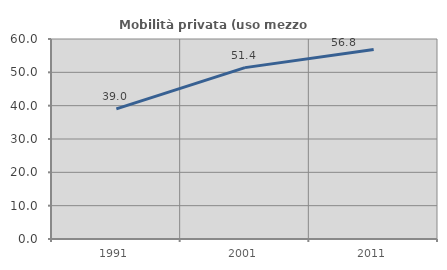
| Category | Mobilità privata (uso mezzo privato) |
|---|---|
| 1991.0 | 39.048 |
| 2001.0 | 51.415 |
| 2011.0 | 56.842 |